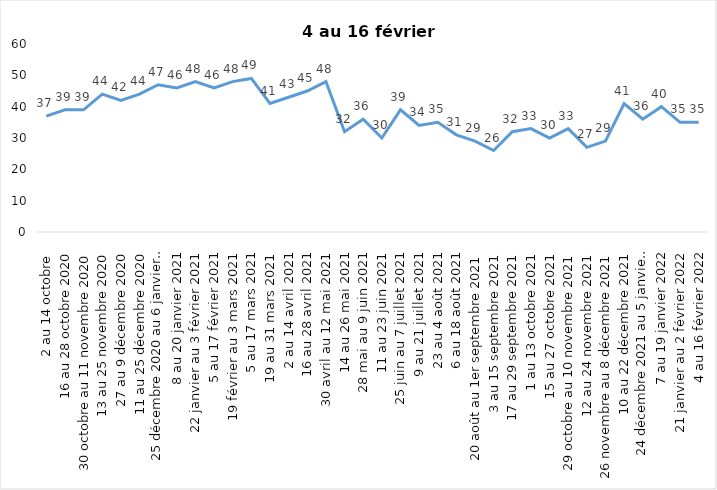
| Category | Toujours aux trois mesures |
|---|---|
| 2 au 14 octobre  | 37 |
| 16 au 28 octobre 2020 | 39 |
| 30 octobre au 11 novembre 2020 | 39 |
| 13 au 25 novembre 2020 | 44 |
| 27 au 9 décembre 2020 | 42 |
| 11 au 25 décembre 2020 | 44 |
| 25 décembre 2020 au 6 janvier  2021 | 47 |
| 8 au 20 janvier 2021 | 46 |
| 22 janvier au 3 février 2021 | 48 |
| 5 au 17 février 2021 | 46 |
| 19 février au 3 mars 2021 | 48 |
| 5 au 17 mars 2021 | 49 |
| 19 au 31 mars 2021 | 41 |
| 2 au 14 avril 2021 | 43 |
| 16 au 28 avril 2021 | 45 |
| 30 avril au 12 mai 2021 | 48 |
| 14 au 26 mai 2021 | 32 |
| 28 mai au 9 juin 2021 | 36 |
| 11 au 23 juin 2021 | 30 |
| 25 juin au 7 juillet 2021 | 39 |
| 9 au 21 juillet 2021 | 34 |
| 23 au 4 août 2021 | 35 |
| 6 au 18 août 2021 | 31 |
| 20 août au 1er septembre 2021 | 29 |
| 3 au 15 septembre 2021 | 26 |
| 17 au 29 septembre 2021 | 32 |
| 1 au 13 octobre 2021 | 33 |
| 15 au 27 octobre 2021 | 30 |
| 29 octobre au 10 novembre 2021 | 33 |
| 12 au 24 novembre 2021 | 27 |
| 26 novembre au 8 décembre 2021 | 29 |
| 10 au 22 décembre 2021 | 41 |
| 24 décembre 2021 au 5 janvier 2022 | 36 |
| 7 au 19 janvier 2022 | 40 |
| 21 janvier au 2 février 2022 | 35 |
| 4 au 16 février 2022 | 35 |